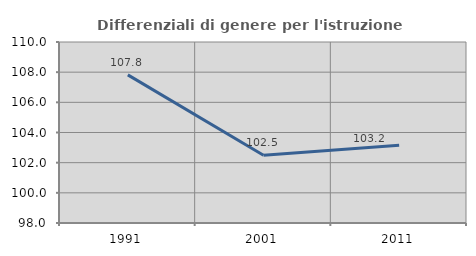
| Category | Differenziali di genere per l'istruzione superiore |
|---|---|
| 1991.0 | 107.819 |
| 2001.0 | 102.496 |
| 2011.0 | 103.156 |